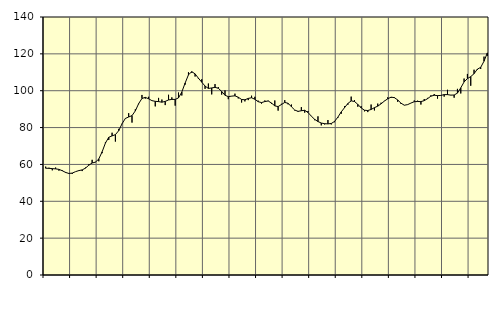
| Category | Piggar | Series 1 |
|---|---|---|
| nan | 58.8 | 57.93 |
| 87.0 | 58.2 | 57.89 |
| 87.0 | 56.8 | 57.73 |
| 87.0 | 58.3 | 57.58 |
| nan | 56.6 | 57.33 |
| 88.0 | 56.9 | 56.59 |
| 88.0 | 55.9 | 55.66 |
| 88.0 | 54.9 | 55.1 |
| nan | 54.8 | 55.29 |
| 89.0 | 56.1 | 56.08 |
| 89.0 | 56.8 | 56.66 |
| 89.0 | 56.4 | 57.04 |
| nan | 58.3 | 57.99 |
| 90.0 | 60.1 | 59.6 |
| 90.0 | 62.5 | 60.78 |
| 90.0 | 61.4 | 61.25 |
| nan | 61.7 | 62.96 |
| 91.0 | 66.1 | 66.83 |
| 91.0 | 72 | 71.6 |
| 91.0 | 73.3 | 74.73 |
| nan | 77.2 | 75.5 |
| 92.0 | 72.4 | 76.16 |
| 92.0 | 79.3 | 78.32 |
| 92.0 | 81.9 | 82.06 |
| nan | 85.1 | 84.96 |
| 93.0 | 87.8 | 85.74 |
| 93.0 | 82.7 | 86.49 |
| 93.0 | 89.9 | 89.05 |
| nan | 92.7 | 92.99 |
| 94.0 | 97.7 | 95.79 |
| 94.0 | 95.7 | 96.39 |
| 94.0 | 96.7 | 95.63 |
| nan | 94.5 | 94.61 |
| 95.0 | 91.5 | 94.24 |
| 95.0 | 96.1 | 94.09 |
| 95.0 | 95.2 | 93.77 |
| nan | 92.2 | 94.2 |
| 96.0 | 97.8 | 94.99 |
| 96.0 | 96.4 | 95.29 |
| 96.0 | 91.9 | 95.28 |
| nan | 99 | 96.09 |
| 97.0 | 97.4 | 99.31 |
| 97.0 | 103.3 | 104.17 |
| 97.0 | 110 | 108.63 |
| nan | 109.7 | 110.35 |
| 98.0 | 107.7 | 109.13 |
| 98.0 | 106.4 | 106.79 |
| 98.0 | 106.2 | 104.64 |
| nan | 101 | 102.52 |
| 99.0 | 103.9 | 101.23 |
| 99.0 | 98 | 101.5 |
| 99.0 | 103.6 | 101.84 |
| nan | 101.9 | 101.31 |
| 0.0 | 97.9 | 99.6 |
| 0.0 | 100.2 | 97.54 |
| 0.0 | 95.4 | 96.78 |
| nan | 97 | 97.06 |
| 1.0 | 98.4 | 97.23 |
| 1.0 | 95.8 | 96.47 |
| 1.0 | 93.6 | 95.25 |
| nan | 94.2 | 95.08 |
| 2.0 | 94.9 | 95.82 |
| 2.0 | 97.3 | 96.18 |
| 2.0 | 96.7 | 95.35 |
| nan | 94.6 | 94.05 |
| 3.0 | 93 | 93.55 |
| 3.0 | 94.7 | 94.12 |
| 3.0 | 94.6 | 94.42 |
| nan | 92.9 | 93.32 |
| 4.0 | 94.7 | 91.77 |
| 4.0 | 89.2 | 91.4 |
| 4.0 | 92.9 | 92.51 |
| nan | 94.9 | 93.64 |
| 5.0 | 92.6 | 93.18 |
| 5.0 | 92.5 | 91.31 |
| 5.0 | 89.3 | 89.53 |
| nan | 88.5 | 88.79 |
| 6.0 | 91.1 | 89.14 |
| 6.0 | 88.1 | 89.38 |
| 6.0 | 89 | 88.2 |
| nan | 86.1 | 86.19 |
| 7.0 | 84 | 84.46 |
| 7.0 | 86.1 | 83.27 |
| 7.0 | 81.2 | 82.46 |
| nan | 81.7 | 82.11 |
| 8.0 | 84.1 | 82 |
| 8.0 | 81.7 | 82.21 |
| 8.0 | 82.9 | 83.34 |
| nan | 85.3 | 85.69 |
| 9.0 | 87.5 | 88.5 |
| 9.0 | 91.6 | 90.8 |
| 9.0 | 92.4 | 93.07 |
| nan | 96.8 | 94.49 |
| 10.0 | 94.9 | 94.14 |
| 10.0 | 91.3 | 92.6 |
| 10.0 | 91.6 | 90.67 |
| nan | 88.8 | 89.42 |
| 11.0 | 88.4 | 89.24 |
| 11.0 | 92.5 | 89.82 |
| 11.0 | 89.3 | 90.81 |
| nan | 93 | 91.62 |
| 12.0 | 93.5 | 92.88 |
| 12.0 | 94.5 | 94.38 |
| 12.0 | 96.4 | 95.6 |
| nan | 96.1 | 96.51 |
| 13.0 | 96.5 | 96.24 |
| 13.0 | 94 | 95 |
| 13.0 | 92.8 | 93.24 |
| nan | 92.2 | 92.13 |
| 14.0 | 92.4 | 92.46 |
| 14.0 | 93.3 | 93.3 |
| 14.0 | 94.7 | 94.04 |
| nan | 94.6 | 94.14 |
| 15.0 | 92.5 | 94.1 |
| 15.0 | 95.5 | 94.6 |
| 15.0 | 96.1 | 95.7 |
| nan | 97.5 | 97.03 |
| 16.0 | 98.2 | 97.54 |
| 16.0 | 95.7 | 97.34 |
| 16.0 | 97.5 | 97.44 |
| nan | 96.8 | 97.89 |
| 17.0 | 100.5 | 97.88 |
| 17.0 | 97.7 | 97.6 |
| 17.0 | 96.2 | 97.67 |
| nan | 101 | 98.7 |
| 18.0 | 98.5 | 101.57 |
| 18.0 | 106.6 | 104.74 |
| 18.0 | 109.1 | 106.58 |
| nan | 102.7 | 107.66 |
| 19.0 | 111.4 | 109.24 |
| 19.0 | 111.3 | 111.71 |
| 19.0 | 111.8 | 112.68 |
| nan | 118.5 | 116.03 |
| 20.0 | 118.9 | 120.52 |